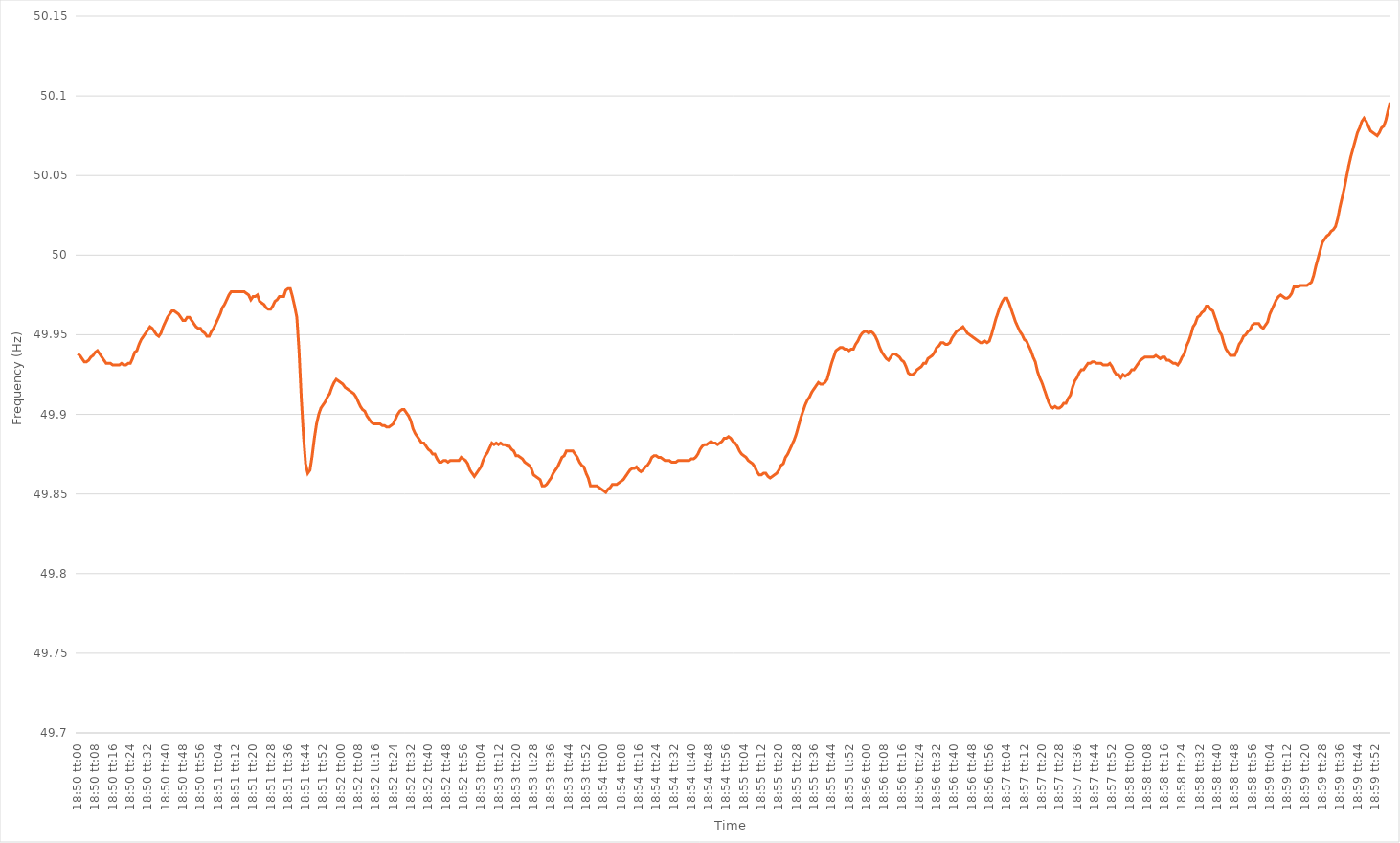
| Category | Series 0 |
|---|---|
| 0.7847222222222222 | 49.938 |
| 0.7847337962962962 | 49.937 |
| 0.7847453703703704 | 49.935 |
| 0.7847569444444445 | 49.933 |
| 0.7847685185185185 | 49.933 |
| 0.7847800925925926 | 49.934 |
| 0.7847916666666667 | 49.936 |
| 0.7848032407407407 | 49.937 |
| 0.7848148148148147 | 49.939 |
| 0.7848263888888889 | 49.94 |
| 0.784837962962963 | 49.938 |
| 0.784849537037037 | 49.936 |
| 0.7848611111111111 | 49.934 |
| 0.7848726851851852 | 49.932 |
| 0.7848842592592593 | 49.932 |
| 0.7848958333333332 | 49.932 |
| 0.7849074074074074 | 49.931 |
| 0.7849189814814815 | 49.931 |
| 0.7849305555555556 | 49.931 |
| 0.7849421296296296 | 49.931 |
| 0.7849537037037037 | 49.932 |
| 0.7849652777777778 | 49.931 |
| 0.784976851851852 | 49.931 |
| 0.7849884259259259 | 49.932 |
| 0.785 | 49.932 |
| 0.7850115740740741 | 49.935 |
| 0.7850231481481481 | 49.939 |
| 0.7850347222222221 | 49.94 |
| 0.7850462962962963 | 49.944 |
| 0.7850578703703704 | 49.947 |
| 0.7850694444444444 | 49.949 |
| 0.7850810185185185 | 49.951 |
| 0.7850925925925926 | 49.953 |
| 0.7851041666666667 | 49.955 |
| 0.7851157407407406 | 49.954 |
| 0.7851273148148148 | 49.952 |
| 0.7851388888888889 | 49.95 |
| 0.785150462962963 | 49.949 |
| 0.785162037037037 | 49.951 |
| 0.7851736111111111 | 49.955 |
| 0.7851851851851852 | 49.958 |
| 0.7851967592592594 | 49.961 |
| 0.7852083333333333 | 49.963 |
| 0.7852199074074074 | 49.965 |
| 0.7852314814814815 | 49.965 |
| 0.7852430555555556 | 49.964 |
| 0.7852546296296296 | 49.963 |
| 0.7852662037037037 | 49.961 |
| 0.7852777777777779 | 49.959 |
| 0.7852893518518519 | 49.959 |
| 0.7853009259259259 | 49.961 |
| 0.7853125 | 49.961 |
| 0.7853240740740741 | 49.959 |
| 0.785335648148148 | 49.957 |
| 0.7853472222222222 | 49.955 |
| 0.7853587962962963 | 49.954 |
| 0.7853703703703704 | 49.954 |
| 0.7853819444444444 | 49.952 |
| 0.7853935185185185 | 49.951 |
| 0.7854050925925926 | 49.949 |
| 0.7854166666666668 | 49.949 |
| 0.7854282407407407 | 49.952 |
| 0.7854398148148148 | 49.954 |
| 0.7854513888888889 | 49.957 |
| 0.785462962962963 | 49.96 |
| 0.785474537037037 | 49.963 |
| 0.7854861111111111 | 49.967 |
| 0.7854976851851853 | 49.969 |
| 0.7855092592592593 | 49.972 |
| 0.7855208333333333 | 49.975 |
| 0.7855324074074074 | 49.977 |
| 0.7855439814814815 | 49.977 |
| 0.7855555555555555 | 49.977 |
| 0.7855671296296296 | 49.977 |
| 0.7855787037037038 | 49.977 |
| 0.7855902777777778 | 49.977 |
| 0.7856018518518518 | 49.977 |
| 0.7856134259259259 | 49.976 |
| 0.785625 | 49.975 |
| 0.7856365740740742 | 49.972 |
| 0.7856481481481481 | 49.974 |
| 0.7856597222222222 | 49.974 |
| 0.7856712962962963 | 49.975 |
| 0.7856828703703704 | 49.971 |
| 0.7856944444444444 | 49.97 |
| 0.7857060185185185 | 49.969 |
| 0.7857175925925927 | 49.967 |
| 0.7857291666666667 | 49.966 |
| 0.7857407407407407 | 49.966 |
| 0.7857523148148148 | 49.968 |
| 0.7857638888888889 | 49.971 |
| 0.7857754629629629 | 49.972 |
| 0.785787037037037 | 49.974 |
| 0.7857986111111112 | 49.974 |
| 0.7858101851851852 | 49.974 |
| 0.7858217592592592 | 49.978 |
| 0.7858333333333333 | 49.979 |
| 0.7858449074074074 | 49.979 |
| 0.7858564814814816 | 49.974 |
| 0.7858680555555555 | 49.968 |
| 0.7858796296296297 | 49.961 |
| 0.7858912037037037 | 49.94 |
| 0.7859027777777778 | 49.911 |
| 0.7859143518518518 | 49.887 |
| 0.7859259259259259 | 49.869 |
| 0.7859375000000001 | 49.863 |
| 0.7859490740740741 | 49.865 |
| 0.7859606481481481 | 49.874 |
| 0.7859722222222222 | 49.885 |
| 0.7859837962962963 | 49.894 |
| 0.7859953703703703 | 49.9 |
| 0.7860069444444444 | 49.904 |
| 0.7860185185185186 | 49.906 |
| 0.7860300925925926 | 49.908 |
| 0.7860416666666666 | 49.911 |
| 0.7860532407407407 | 49.913 |
| 0.7860648148148148 | 49.917 |
| 0.786076388888889 | 49.92 |
| 0.7860879629629629 | 49.922 |
| 0.786099537037037 | 49.921 |
| 0.7861111111111111 | 49.92 |
| 0.7861226851851852 | 49.919 |
| 0.7861342592592592 | 49.917 |
| 0.7861458333333333 | 49.916 |
| 0.7861574074074075 | 49.915 |
| 0.7861689814814815 | 49.914 |
| 0.7861805555555555 | 49.913 |
| 0.7861921296296296 | 49.911 |
| 0.7862037037037037 | 49.908 |
| 0.7862152777777777 | 49.905 |
| 0.7862268518518518 | 49.903 |
| 0.786238425925926 | 49.902 |
| 0.78625 | 49.899 |
| 0.786261574074074 | 49.897 |
| 0.7862731481481481 | 49.895 |
| 0.7862847222222222 | 49.894 |
| 0.7862962962962964 | 49.894 |
| 0.7863078703703703 | 49.894 |
| 0.7863194444444445 | 49.894 |
| 0.7863310185185185 | 49.893 |
| 0.7863425925925926 | 49.893 |
| 0.7863541666666666 | 49.892 |
| 0.7863657407407407 | 49.892 |
| 0.7863773148148149 | 49.893 |
| 0.7863888888888889 | 49.894 |
| 0.786400462962963 | 49.897 |
| 0.786412037037037 | 49.9 |
| 0.7864236111111111 | 49.902 |
| 0.7864351851851853 | 49.903 |
| 0.7864467592592592 | 49.903 |
| 0.7864583333333334 | 49.901 |
| 0.7864699074074074 | 49.899 |
| 0.7864814814814814 | 49.896 |
| 0.7864930555555555 | 49.891 |
| 0.7865046296296296 | 49.888 |
| 0.7865162037037038 | 49.886 |
| 0.7865277777777777 | 49.884 |
| 0.7865393518518519 | 49.882 |
| 0.7865509259259259 | 49.882 |
| 0.7865625 | 49.88 |
| 0.786574074074074 | 49.878 |
| 0.7865856481481481 | 49.877 |
| 0.7865972222222223 | 49.875 |
| 0.7866087962962963 | 49.875 |
| 0.7866203703703704 | 49.872 |
| 0.7866319444444444 | 49.87 |
| 0.7866435185185185 | 49.87 |
| 0.7866550925925927 | 49.871 |
| 0.7866666666666666 | 49.871 |
| 0.7866782407407408 | 49.87 |
| 0.7866898148148148 | 49.871 |
| 0.786701388888889 | 49.871 |
| 0.7867129629629629 | 49.871 |
| 0.786724537037037 | 49.871 |
| 0.7867361111111112 | 49.871 |
| 0.7867476851851851 | 49.873 |
| 0.7867592592592593 | 49.872 |
| 0.7867708333333333 | 49.871 |
| 0.7867824074074075 | 49.869 |
| 0.7867939814814814 | 49.865 |
| 0.7868055555555555 | 49.863 |
| 0.7868171296296297 | 49.861 |
| 0.7868287037037037 | 49.863 |
| 0.7868402777777778 | 49.865 |
| 0.7868518518518518 | 49.867 |
| 0.786863425925926 | 49.871 |
| 0.7868750000000001 | 49.874 |
| 0.786886574074074 | 49.876 |
| 0.7868981481481482 | 49.879 |
| 0.7869097222222222 | 49.882 |
| 0.7869212962962964 | 49.881 |
| 0.7869328703703703 | 49.882 |
| 0.7869444444444444 | 49.881 |
| 0.7869560185185186 | 49.882 |
| 0.7869675925925925 | 49.881 |
| 0.7869791666666667 | 49.881 |
| 0.7869907407407407 | 49.88 |
| 0.7870023148148149 | 49.88 |
| 0.7870138888888888 | 49.878 |
| 0.7870254629629629 | 49.877 |
| 0.7870370370370371 | 49.874 |
| 0.7870486111111111 | 49.874 |
| 0.7870601851851852 | 49.873 |
| 0.7870717592592592 | 49.872 |
| 0.7870833333333334 | 49.87 |
| 0.7870949074074075 | 49.869 |
| 0.7871064814814814 | 49.868 |
| 0.7871180555555556 | 49.866 |
| 0.7871296296296296 | 49.862 |
| 0.7871412037037038 | 49.861 |
| 0.7871527777777777 | 49.86 |
| 0.7871643518518519 | 49.859 |
| 0.787175925925926 | 49.855 |
| 0.7871874999999999 | 49.855 |
| 0.7871990740740741 | 49.856 |
| 0.7872106481481481 | 49.858 |
| 0.7872222222222223 | 49.86 |
| 0.7872337962962962 | 49.863 |
| 0.7872453703703703 | 49.865 |
| 0.7872569444444445 | 49.867 |
| 0.7872685185185185 | 49.87 |
| 0.7872800925925926 | 49.873 |
| 0.7872916666666666 | 49.874 |
| 0.7873032407407408 | 49.877 |
| 0.7873148148148149 | 49.877 |
| 0.7873263888888888 | 49.877 |
| 0.787337962962963 | 49.877 |
| 0.787349537037037 | 49.875 |
| 0.7873611111111112 | 49.873 |
| 0.7873726851851851 | 49.87 |
| 0.7873842592592593 | 49.868 |
| 0.7873958333333334 | 49.867 |
| 0.7874074074074073 | 49.863 |
| 0.7874189814814815 | 49.86 |
| 0.7874305555555555 | 49.855 |
| 0.7874421296296297 | 49.855 |
| 0.7874537037037036 | 49.855 |
| 0.7874652777777778 | 49.855 |
| 0.7874768518518519 | 49.854 |
| 0.7874884259259259 | 49.853 |
| 0.7875 | 49.852 |
| 0.787511574074074 | 49.851 |
| 0.7875231481481482 | 49.853 |
| 0.7875347222222223 | 49.854 |
| 0.7875462962962962 | 49.856 |
| 0.7875578703703704 | 49.856 |
| 0.7875694444444444 | 49.856 |
| 0.7875810185185186 | 49.857 |
| 0.7875925925925925 | 49.858 |
| 0.7876041666666667 | 49.859 |
| 0.7876157407407408 | 49.861 |
| 0.7876273148148147 | 49.863 |
| 0.7876388888888889 | 49.865 |
| 0.7876504629629629 | 49.866 |
| 0.7876620370370371 | 49.866 |
| 0.787673611111111 | 49.867 |
| 0.7876851851851852 | 49.865 |
| 0.7876967592592593 | 49.864 |
| 0.7877083333333333 | 49.865 |
| 0.7877199074074074 | 49.867 |
| 0.7877314814814814 | 49.868 |
| 0.7877430555555556 | 49.87 |
| 0.7877546296296297 | 49.873 |
| 0.7877662037037036 | 49.874 |
| 0.7877777777777778 | 49.874 |
| 0.7877893518518518 | 49.873 |
| 0.787800925925926 | 49.873 |
| 0.7878124999999999 | 49.872 |
| 0.7878240740740741 | 49.871 |
| 0.7878356481481482 | 49.871 |
| 0.7878472222222223 | 49.871 |
| 0.7878587962962963 | 49.87 |
| 0.7878703703703703 | 49.87 |
| 0.7878819444444445 | 49.87 |
| 0.7878935185185186 | 49.871 |
| 0.7879050925925926 | 49.871 |
| 0.7879166666666667 | 49.871 |
| 0.7879282407407407 | 49.871 |
| 0.7879398148148148 | 49.871 |
| 0.7879513888888888 | 49.871 |
| 0.787962962962963 | 49.872 |
| 0.7879745370370371 | 49.872 |
| 0.787986111111111 | 49.873 |
| 0.7879976851851852 | 49.875 |
| 0.7880092592592592 | 49.878 |
| 0.7880208333333334 | 49.88 |
| 0.7880324074074073 | 49.881 |
| 0.7880439814814815 | 49.881 |
| 0.7880555555555556 | 49.882 |
| 0.7880671296296297 | 49.883 |
| 0.7880787037037037 | 49.882 |
| 0.7880902777777777 | 49.882 |
| 0.7881018518518519 | 49.881 |
| 0.788113425925926 | 49.882 |
| 0.788125 | 49.883 |
| 0.7881365740740741 | 49.885 |
| 0.7881481481481482 | 49.885 |
| 0.7881597222222222 | 49.886 |
| 0.7881712962962962 | 49.885 |
| 0.7881828703703704 | 49.883 |
| 0.7881944444444445 | 49.882 |
| 0.7882060185185185 | 49.88 |
| 0.7882175925925926 | 49.877 |
| 0.7882291666666666 | 49.875 |
| 0.7882407407407408 | 49.874 |
| 0.7882523148148147 | 49.873 |
| 0.7882638888888889 | 49.871 |
| 0.788275462962963 | 49.87 |
| 0.7882870370370371 | 49.869 |
| 0.7882986111111111 | 49.867 |
| 0.7883101851851851 | 49.864 |
| 0.7883217592592593 | 49.862 |
| 0.7883333333333334 | 49.862 |
| 0.7883449074074074 | 49.863 |
| 0.7883564814814815 | 49.863 |
| 0.7883680555555556 | 49.861 |
| 0.7883796296296296 | 49.86 |
| 0.7883912037037036 | 49.861 |
| 0.7884027777777778 | 49.862 |
| 0.7884143518518519 | 49.863 |
| 0.7884259259259259 | 49.865 |
| 0.7884375 | 49.868 |
| 0.788449074074074 | 49.869 |
| 0.7884606481481482 | 49.873 |
| 0.7884722222222221 | 49.875 |
| 0.7884837962962963 | 49.878 |
| 0.7884953703703704 | 49.881 |
| 0.7885069444444445 | 49.884 |
| 0.7885185185185185 | 49.888 |
| 0.7885300925925925 | 49.893 |
| 0.7885416666666667 | 49.898 |
| 0.7885532407407408 | 49.902 |
| 0.7885648148148148 | 49.906 |
| 0.7885763888888889 | 49.909 |
| 0.788587962962963 | 49.911 |
| 0.788599537037037 | 49.914 |
| 0.788611111111111 | 49.916 |
| 0.7886226851851852 | 49.918 |
| 0.7886342592592593 | 49.92 |
| 0.7886458333333333 | 49.919 |
| 0.7886574074074074 | 49.919 |
| 0.7886689814814815 | 49.92 |
| 0.7886805555555556 | 49.922 |
| 0.7886921296296295 | 49.927 |
| 0.7887037037037037 | 49.932 |
| 0.7887152777777778 | 49.936 |
| 0.7887268518518519 | 49.94 |
| 0.7887384259259259 | 49.941 |
| 0.78875 | 49.942 |
| 0.7887615740740741 | 49.942 |
| 0.7887731481481483 | 49.941 |
| 0.7887847222222222 | 49.941 |
| 0.7887962962962963 | 49.94 |
| 0.7888078703703704 | 49.941 |
| 0.7888194444444444 | 49.941 |
| 0.7888310185185184 | 49.944 |
| 0.7888425925925926 | 49.946 |
| 0.7888541666666667 | 49.949 |
| 0.7888657407407407 | 49.951 |
| 0.7888773148148148 | 49.952 |
| 0.7888888888888889 | 49.952 |
| 0.788900462962963 | 49.951 |
| 0.7889120370370369 | 49.952 |
| 0.7889236111111111 | 49.951 |
| 0.7889351851851852 | 49.949 |
| 0.7889467592592593 | 49.946 |
| 0.7889583333333333 | 49.942 |
| 0.7889699074074074 | 49.939 |
| 0.7889814814814815 | 49.937 |
| 0.7889930555555557 | 49.935 |
| 0.7890046296296296 | 49.934 |
| 0.7890162037037037 | 49.936 |
| 0.7890277777777778 | 49.938 |
| 0.7890393518518519 | 49.938 |
| 0.7890509259259259 | 49.937 |
| 0.7890625 | 49.936 |
| 0.7890740740740741 | 49.934 |
| 0.7890856481481481 | 49.933 |
| 0.7890972222222222 | 49.93 |
| 0.7891087962962963 | 49.926 |
| 0.7891203703703704 | 49.925 |
| 0.7891319444444443 | 49.925 |
| 0.7891435185185185 | 49.926 |
| 0.7891550925925926 | 49.928 |
| 0.7891666666666667 | 49.929 |
| 0.7891782407407407 | 49.93 |
| 0.7891898148148148 | 49.932 |
| 0.7892013888888889 | 49.932 |
| 0.7892129629629631 | 49.935 |
| 0.789224537037037 | 49.936 |
| 0.7892361111111111 | 49.937 |
| 0.7892476851851852 | 49.939 |
| 0.7892592592592593 | 49.942 |
| 0.7892708333333333 | 49.943 |
| 0.7892824074074074 | 49.945 |
| 0.7892939814814816 | 49.945 |
| 0.7893055555555556 | 49.944 |
| 0.7893171296296296 | 49.944 |
| 0.7893287037037037 | 49.945 |
| 0.7893402777777778 | 49.948 |
| 0.7893518518518517 | 49.95 |
| 0.7893634259259259 | 49.952 |
| 0.789375 | 49.953 |
| 0.7893865740740741 | 49.954 |
| 0.7893981481481481 | 49.955 |
| 0.7894097222222222 | 49.953 |
| 0.7894212962962963 | 49.951 |
| 0.7894328703703705 | 49.95 |
| 0.7894444444444444 | 49.949 |
| 0.7894560185185185 | 49.948 |
| 0.7894675925925926 | 49.947 |
| 0.7894791666666667 | 49.946 |
| 0.7894907407407407 | 49.945 |
| 0.7895023148148148 | 49.945 |
| 0.789513888888889 | 49.946 |
| 0.789525462962963 | 49.945 |
| 0.789537037037037 | 49.946 |
| 0.7895486111111111 | 49.95 |
| 0.7895601851851852 | 49.955 |
| 0.7895717592592592 | 49.96 |
| 0.7895833333333333 | 49.964 |
| 0.7895949074074075 | 49.968 |
| 0.7896064814814815 | 49.971 |
| 0.7896180555555555 | 49.973 |
| 0.7896296296296296 | 49.973 |
| 0.7896412037037037 | 49.97 |
| 0.7896527777777779 | 49.966 |
| 0.7896643518518518 | 49.962 |
| 0.789675925925926 | 49.958 |
| 0.7896875 | 49.955 |
| 0.7896990740740741 | 49.952 |
| 0.7897106481481481 | 49.95 |
| 0.7897222222222222 | 49.947 |
| 0.7897337962962964 | 49.946 |
| 0.7897453703703704 | 49.943 |
| 0.7897569444444444 | 49.94 |
| 0.7897685185185185 | 49.936 |
| 0.7897800925925926 | 49.933 |
| 0.7897916666666666 | 49.927 |
| 0.7898032407407407 | 49.923 |
| 0.7898148148148149 | 49.92 |
| 0.7898263888888889 | 49.916 |
| 0.7898379629629629 | 49.912 |
| 0.789849537037037 | 49.908 |
| 0.7898611111111111 | 49.905 |
| 0.7898726851851853 | 49.904 |
| 0.7898842592592592 | 49.905 |
| 0.7898958333333334 | 49.904 |
| 0.7899074074074074 | 49.904 |
| 0.7899189814814815 | 49.905 |
| 0.7899305555555555 | 49.907 |
| 0.7899421296296296 | 49.907 |
| 0.7899537037037038 | 49.91 |
| 0.7899652777777778 | 49.912 |
| 0.7899768518518518 | 49.917 |
| 0.7899884259259259 | 49.921 |
| 0.79 | 49.923 |
| 0.790011574074074 | 49.926 |
| 0.7900231481481481 | 49.928 |
| 0.7900347222222223 | 49.928 |
| 0.7900462962962963 | 49.93 |
| 0.7900578703703703 | 49.932 |
| 0.7900694444444444 | 49.932 |
| 0.7900810185185185 | 49.933 |
| 0.7900925925925927 | 49.933 |
| 0.7901041666666666 | 49.932 |
| 0.7901157407407408 | 49.932 |
| 0.7901273148148148 | 49.932 |
| 0.790138888888889 | 49.931 |
| 0.7901504629629629 | 49.931 |
| 0.790162037037037 | 49.931 |
| 0.7901736111111112 | 49.932 |
| 0.7901851851851852 | 49.93 |
| 0.7901967592592593 | 49.927 |
| 0.7902083333333333 | 49.925 |
| 0.7902199074074074 | 49.925 |
| 0.7902314814814814 | 49.923 |
| 0.7902430555555555 | 49.925 |
| 0.7902546296296297 | 49.924 |
| 0.7902662037037037 | 49.925 |
| 0.7902777777777777 | 49.926 |
| 0.7902893518518518 | 49.928 |
| 0.7903009259259259 | 49.928 |
| 0.7903125000000001 | 49.93 |
| 0.790324074074074 | 49.932 |
| 0.7903356481481482 | 49.934 |
| 0.7903472222222222 | 49.935 |
| 0.7903587962962964 | 49.936 |
| 0.7903703703703703 | 49.936 |
| 0.7903819444444444 | 49.936 |
| 0.7903935185185186 | 49.936 |
| 0.7904050925925926 | 49.936 |
| 0.7904166666666667 | 49.937 |
| 0.7904282407407407 | 49.936 |
| 0.7904398148148148 | 49.935 |
| 0.790451388888889 | 49.936 |
| 0.7904629629629629 | 49.936 |
| 0.7904745370370371 | 49.934 |
| 0.7904861111111111 | 49.934 |
| 0.7904976851851853 | 49.933 |
| 0.7905092592592592 | 49.932 |
| 0.7905208333333333 | 49.932 |
| 0.7905324074074075 | 49.931 |
| 0.7905439814814814 | 49.933 |
| 0.7905555555555556 | 49.936 |
| 0.7905671296296296 | 49.938 |
| 0.7905787037037038 | 49.943 |
| 0.7905902777777777 | 49.946 |
| 0.7906018518518518 | 49.95 |
| 0.790613425925926 | 49.955 |
| 0.790625 | 49.957 |
| 0.7906365740740741 | 49.961 |
| 0.7906481481481481 | 49.962 |
| 0.7906597222222222 | 49.964 |
| 0.7906712962962964 | 49.965 |
| 0.7906828703703703 | 49.968 |
| 0.7906944444444445 | 49.968 |
| 0.7907060185185185 | 49.966 |
| 0.7907175925925927 | 49.965 |
| 0.7907291666666666 | 49.961 |
| 0.7907407407407407 | 49.957 |
| 0.7907523148148149 | 49.952 |
| 0.7907638888888888 | 49.95 |
| 0.790775462962963 | 49.945 |
| 0.790787037037037 | 49.941 |
| 0.7907986111111112 | 49.939 |
| 0.7908101851851851 | 49.937 |
| 0.7908217592592592 | 49.937 |
| 0.7908333333333334 | 49.937 |
| 0.7908449074074074 | 49.94 |
| 0.7908564814814815 | 49.944 |
| 0.7908680555555555 | 49.946 |
| 0.7908796296296297 | 49.949 |
| 0.7908912037037038 | 49.95 |
| 0.7909027777777777 | 49.952 |
| 0.7909143518518519 | 49.953 |
| 0.7909259259259259 | 49.956 |
| 0.7909375000000001 | 49.957 |
| 0.790949074074074 | 49.957 |
| 0.7909606481481481 | 49.957 |
| 0.7909722222222223 | 49.955 |
| 0.7909837962962962 | 49.954 |
| 0.7909953703703704 | 49.956 |
| 0.7910069444444444 | 49.958 |
| 0.7910185185185186 | 49.963 |
| 0.7910300925925925 | 49.966 |
| 0.7910416666666666 | 49.969 |
| 0.7910532407407408 | 49.972 |
| 0.7910648148148148 | 49.974 |
| 0.7910763888888889 | 49.975 |
| 0.7910879629629629 | 49.974 |
| 0.7910995370370371 | 49.973 |
| 0.7911111111111112 | 49.973 |
| 0.7911226851851851 | 49.974 |
| 0.7911342592592593 | 49.976 |
| 0.7911458333333333 | 49.98 |
| 0.7911574074074075 | 49.98 |
| 0.7911689814814814 | 49.98 |
| 0.7911805555555556 | 49.981 |
| 0.7911921296296297 | 49.981 |
| 0.7912037037037036 | 49.981 |
| 0.7912152777777778 | 49.981 |
| 0.7912268518518518 | 49.982 |
| 0.791238425925926 | 49.983 |
| 0.7912499999999999 | 49.987 |
| 0.791261574074074 | 49.993 |
| 0.7912731481481482 | 49.998 |
| 0.7912847222222222 | 50.003 |
| 0.7912962962962963 | 50.008 |
| 0.7913078703703703 | 50.01 |
| 0.7913194444444445 | 50.012 |
| 0.7913310185185186 | 50.013 |
| 0.7913425925925925 | 50.015 |
| 0.7913541666666667 | 50.016 |
| 0.7913657407407407 | 50.018 |
| 0.7913773148148149 | 50.023 |
| 0.7913888888888888 | 50.03 |
| 0.791400462962963 | 50.036 |
| 0.7914120370370371 | 50.042 |
| 0.791423611111111 | 50.049 |
| 0.7914351851851852 | 50.056 |
| 0.7914467592592592 | 50.062 |
| 0.7914583333333334 | 50.067 |
| 0.7914699074074073 | 50.072 |
| 0.7914814814814815 | 50.077 |
| 0.7914930555555556 | 50.08 |
| 0.7915046296296296 | 50.084 |
| 0.7915162037037037 | 50.086 |
| 0.7915277777777777 | 50.084 |
| 0.7915393518518519 | 50.081 |
| 0.791550925925926 | 50.078 |
| 0.7915625 | 50.077 |
| 0.7915740740740741 | 50.076 |
| 0.7915856481481481 | 50.075 |
| 0.7915972222222223 | 50.077 |
| 0.7916087962962962 | 50.08 |
| 0.7916203703703704 | 50.081 |
| 0.7916319444444445 | 50.085 |
| 0.7916435185185186 | 50.091 |
| 0.7916550925925926 | 50.096 |